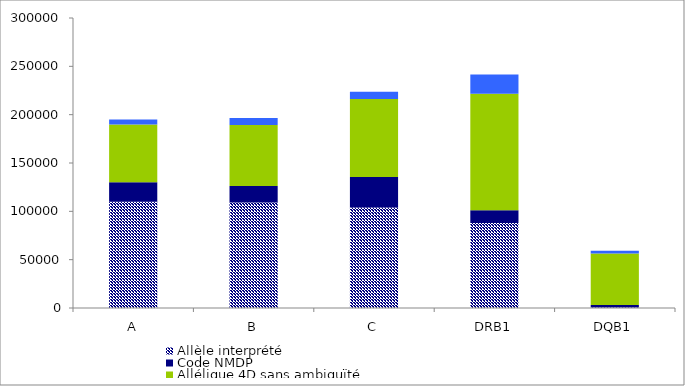
| Category | Allèle interprété | Code NMDP | Allélique 4D sans ambiguïté | Mixte - 1 allèle en 4D et 1 allèle avec code NMDP |
|---|---|---|---|---|
| A | 109851 | 20226 | 59830 | 4991 |
| B | 109150 | 16946 | 63308 | 7197 |
| C | 104084 | 31305 | 80717 | 7574 |
| DRB1 | 87888 | 13174 | 120690 | 19721 |
| DQB1 | 490 | 2554 | 53392 | 2871 |